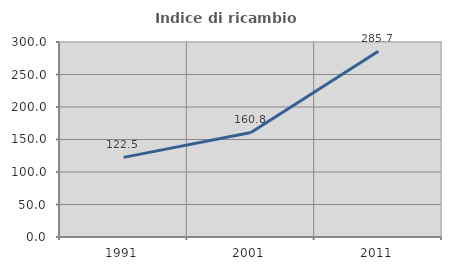
| Category | Indice di ricambio occupazionale  |
|---|---|
| 1991.0 | 122.5 |
| 2001.0 | 160.784 |
| 2011.0 | 285.654 |